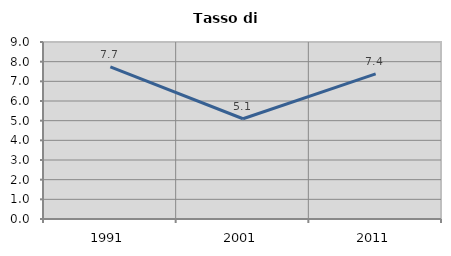
| Category | Tasso di disoccupazione   |
|---|---|
| 1991.0 | 7.734 |
| 2001.0 | 5.098 |
| 2011.0 | 7.38 |